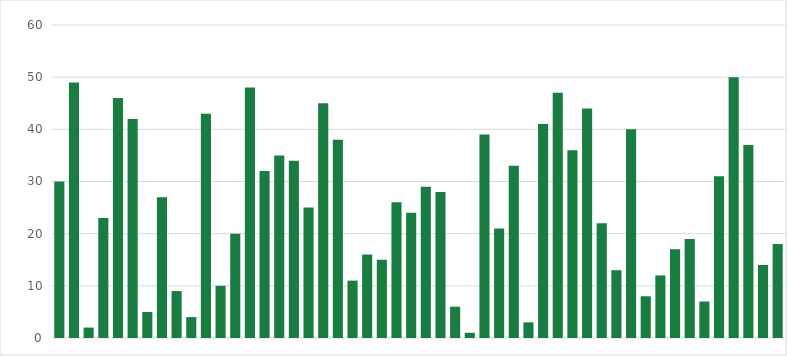
| Category | Series 0 |
|---|---|
| 0 | 30 |
| 1 | 49 |
| 2 | 2 |
| 3 | 23 |
| 4 | 46 |
| 5 | 42 |
| 6 | 5 |
| 7 | 27 |
| 8 | 9 |
| 9 | 4 |
| 10 | 43 |
| 11 | 10 |
| 12 | 20 |
| 13 | 48 |
| 14 | 32 |
| 15 | 35 |
| 16 | 34 |
| 17 | 25 |
| 18 | 45 |
| 19 | 38 |
| 20 | 11 |
| 21 | 16 |
| 22 | 15 |
| 23 | 26 |
| 24 | 24 |
| 25 | 29 |
| 26 | 28 |
| 27 | 6 |
| 28 | 1 |
| 29 | 39 |
| 30 | 21 |
| 31 | 33 |
| 32 | 3 |
| 33 | 41 |
| 34 | 47 |
| 35 | 36 |
| 36 | 44 |
| 37 | 22 |
| 38 | 13 |
| 39 | 40 |
| 40 | 8 |
| 41 | 12 |
| 42 | 17 |
| 43 | 19 |
| 44 | 7 |
| 45 | 31 |
| 46 | 50 |
| 47 | 37 |
| 48 | 14 |
| 49 | 18 |